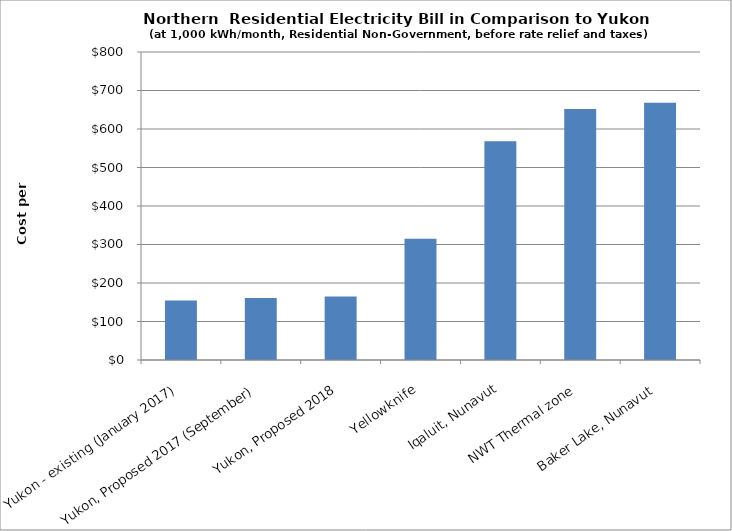
| Category | Monthly Bills before rate relief and taxes |
|---|---|
| Yukon - existing (January 2017) | 154.438 |
| Yukon, Proposed 2017 (September) | 161.356 |
| Yukon, Proposed 2018 | 165.037 |
| Yellowknife | 315.179 |
| Iqaluit, Nunavut | 568.3 |
| NWT Thermal zone | 651.9 |
| Baker Lake, Nunavut | 668.5 |